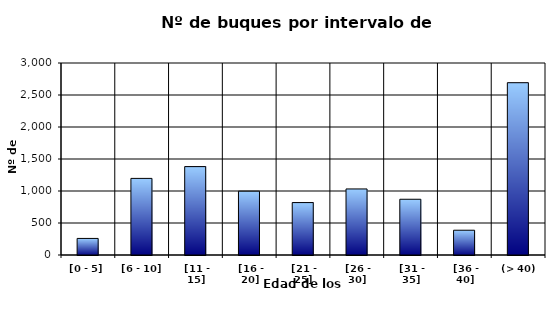
| Category | [0 - 5] |
|---|---|
| [0 - 5] | 259 |
|  [6 - 10] | 1197 |
|  [11 - 15] | 1381 |
|  [16 - 20] | 997 |
|  [21 - 25] | 819 |
|  [26 - 30] | 1032 |
|  [31 - 35] | 871 |
|  [36 - 40] | 387 |
|  (> 40) | 2692 |